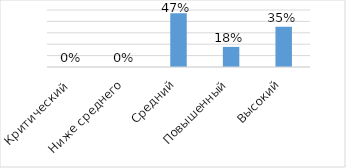
| Category | Series 0 |
|---|---|
| Критический  | 0 |
| Ниже среднего | 0 |
| Средний | 0.471 |
| Повышенный | 0.176 |
| Высокий | 0.353 |